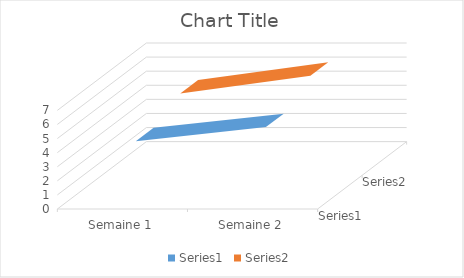
| Category | Series 0 | Series 1 |
|---|---|---|
| Semaine 1 | 4 | 5 |
| Semaine 2 | 5 | 6.25 |
| Semaine 3 | 6 | 7.5 |
| Semaine 4 | 7 | 8.75 |
| Semaine 5 | 8 | 10 |
| Semaine 6 | 9 | 11.25 |
| Semaine 7 | 10 | 12.5 |
| Semaine 8 | 11 | 13.75 |
| Semaine 9 | 12 | 15 |
| Semaine 10 | 13 | 16.25 |
| Semaine 11 | 14 | 17.5 |
| Semaine 12 | 15 | 18.75 |
| Semaine 13 | 16 | 20 |
| Semaine 14 | 17 | 21.25 |
| Semaine 15 | 18 | 22.5 |
| Semaine 16 | 19 | 23.75 |
| Semaine 17 | 20 | 25 |
| Semaine 18 | 21 | 26.25 |
| Semaine 19 | 22 | 27.5 |
| Semaine 20 | 23 | 28.75 |
| Semaine 21 | 24 | 30 |